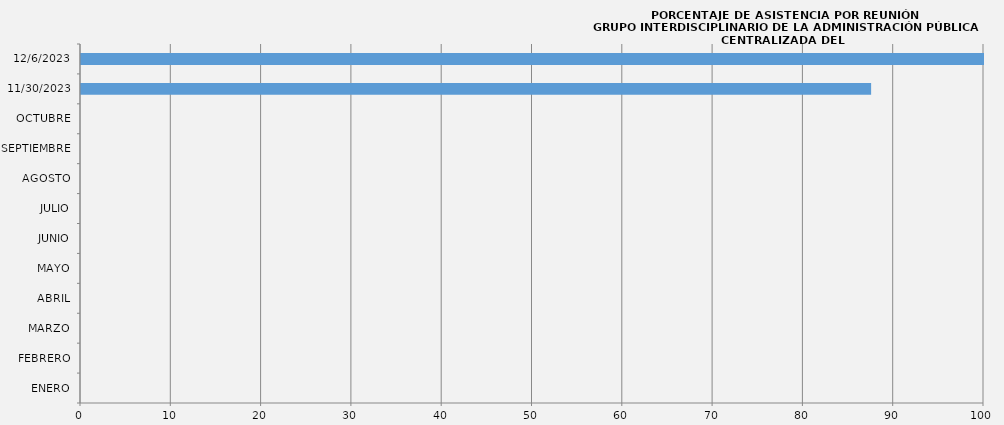
| Category | Series 0 |
|---|---|
| ENERO | 0 |
| FEBRERO | 0 |
| MARZO | 0 |
| ABRIL | 0 |
| MAYO | 0 |
| JUNIO | 0 |
| JULIO | 0 |
| AGOSTO | 0 |
| SEPTIEMBRE | 0 |
| OCTUBRE | 0 |
| 30/11/2023 | 87.5 |
| 06/12/2023 | 100 |